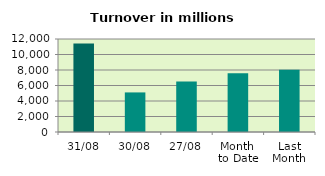
| Category | Series 0 |
|---|---|
| 31/08 | 11418.125 |
| 30/08 | 5107.183 |
| 27/08 | 6527.29 |
| Month 
to Date | 7565.704 |
| Last
Month | 8019.786 |